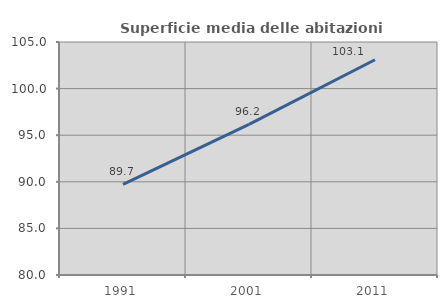
| Category | Superficie media delle abitazioni occupate |
|---|---|
| 1991.0 | 89.715 |
| 2001.0 | 96.154 |
| 2011.0 | 103.093 |